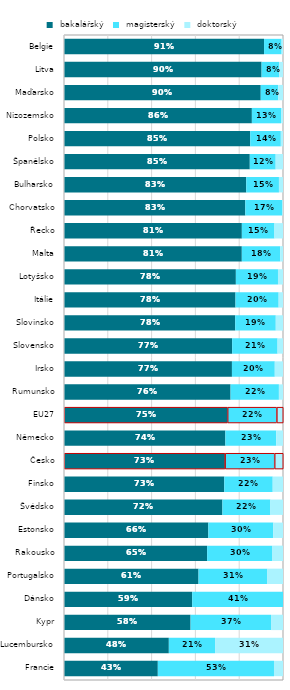
| Category |  bakalářský |  magisterský |  doktorský |
|---|---|---|---|
| Francie | 0.428 | 0.53 | 0.041 |
| Lucembursko | 0.479 | 0.211 | 0.31 |
| Kypr | 0.578 | 0.367 | 0.055 |
| Dánsko | 0.585 | 0.415 | 0 |
| Portugalsko | 0.614 | 0.314 | 0.071 |
| Rakousko | 0.654 | 0.296 | 0.05 |
| Estonsko | 0.659 | 0.297 | 0.044 |
| Švédsko | 0.723 | 0.219 | 0.057 |
| Finsko | 0.732 | 0.221 | 0.047 |
| Česko | 0.735 | 0.226 | 0.039 |
| Německo | 0.737 | 0.232 | 0.031 |
| EU27 | 0.746 | 0.224 | 0.029 |
| Rumunsko | 0.761 | 0.221 | 0.019 |
| Irsko | 0.767 | 0.196 | 0.038 |
| Slovensko | 0.768 | 0.207 | 0.025 |
| Slovinsko | 0.782 | 0.185 | 0.033 |
| Itálie | 0.783 | 0.197 | 0.02 |
| Lotyšsko | 0.785 | 0.192 | 0.023 |
| Malta | 0.812 | 0.176 | 0.013 |
| Řecko | 0.812 | 0.149 | 0.039 |
| Chorvatsko | 0.828 | 0.168 | 0.004 |
| Bulharsko | 0.832 | 0.149 | 0.019 |
| Španělsko | 0.848 | 0.118 | 0.033 |
| Polsko | 0.85 | 0.14 | 0.01 |
| Nizozemsko | 0.858 | 0.133 | 0.009 |
| Maďarsko | 0.898 | 0.08 | 0.022 |
| Litva | 0.902 | 0.08 | 0.017 |
| Belgie | 0.914 | 0.08 | 0.006 |